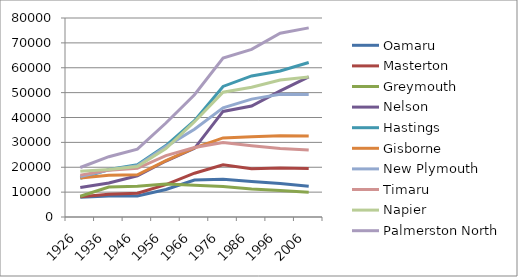
| Category | Oamaru | Masterton | Greymouth | Nelson | Hastings | Gisborne | New Plymouth | Timaru | Napier | Palmerston North |
|---|---|---|---|---|---|---|---|---|---|---|
| 1926.0 | 7891.988 | 8188 | 8349.824 | 11829.077 | 15571.389 | 15637.804 | 16263.394 | 16840.203 | 18363.66 | 19902.022 |
| 1936.0 | 8447.079 | 9164 | 12054.585 | 13661.467 | 19106.279 | 16745.754 | 18898.109 | 18839.958 | 19137.815 | 24247.34 |
| 1946.0 | 8424.107 | 9535 | 12370.262 | 16577 | 20999.78 | 16984 | 20642 | 19596 | 20297 | 27294 |
| 1956.0 | 11036.583 | 13000 | 13216.609 | 22503 | 28702.454 | 22622 | 28292 | 24694 | 27507 | 37775 |
| 1966.0 | 14848.32 | 17596 | 12782.358 | 27615 | 38700.333 | 27804 | 35280 | 27946 | 38309 | 49140 |
| 1976.0 | 15179.383 | 21001 | 12232.896 | 42433 | 52488.089 | 31790 | 43914 | 29958 | 50164 | 63873 |
| 1986.0 | 14247 | 19353 | 11261 | 44593 | 56718 | 32238 | 47384 | 28621 | 52151 | 67405 |
| 1996.0 | 13464.812 | 19686 | 10652.052 | 50691 | 58675 | 32653 | 49306 | 27521 | 55044 | 73862 |
| 2006.0 | 12383.552 | 19497 | 9994.63 | 56367 | 62118 | 32529 | 49281 | 26886 | 56286 | 76032 |